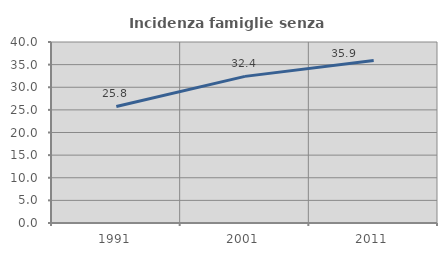
| Category | Incidenza famiglie senza nuclei |
|---|---|
| 1991.0 | 25.758 |
| 2001.0 | 32.401 |
| 2011.0 | 35.92 |